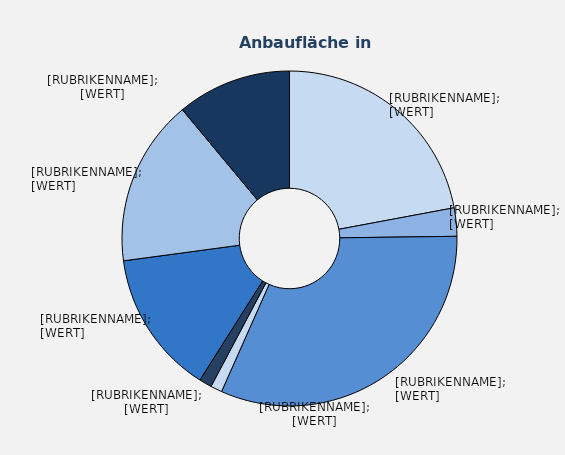
| Category | Series 1 |
|---|---|
| Feldsalat | 7.93 |
| Kopfsalat | 0.98 |
| sonstige Salate | 11.45 |
| Paprika | 0.4 |
| Radies | 0.44 |
| Salatgurken | 4.99 |
| Tomaten | 5.78 |
| sonstige Gemüsearten | 3.97 |